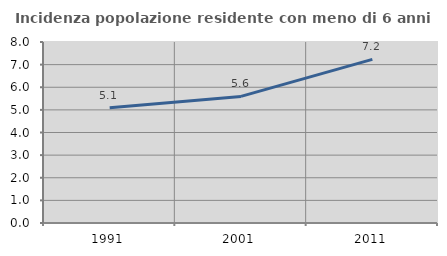
| Category | Incidenza popolazione residente con meno di 6 anni |
|---|---|
| 1991.0 | 5.092 |
| 2001.0 | 5.595 |
| 2011.0 | 7.234 |